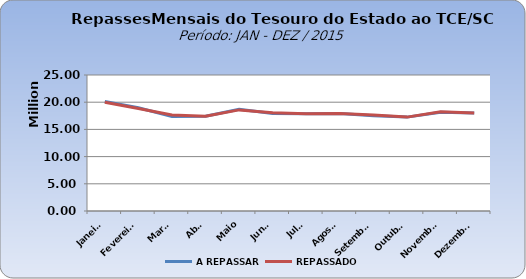
| Category | A REPASSAR | REPASSADO |
|---|---|---|
| Janeiro | 20143472.7 | 20007174.85 |
| Fevereiro | 18972422.37 | 18835471.71 |
| Março | 17384175.9 | 17668621.16 |
| Abril | 17439423.97 | 17418416.19 |
| Maio | 18711095.6 | 18584608.13 |
| Junho | 17930414.95 | 18066608.22 |
| Julho | 17877042.85 | 17877042.85 |
| Agosto | 17913265.96 | 17914012.95 |
| Setembro | 17518302.31 | 17663554.48 |
| Outubro | 17258293.42 | 17258319.12 |
| Novembro | 18142526.75 | 18253100.49 |
| Dezembro | 17997415.92 | 18004795.99 |